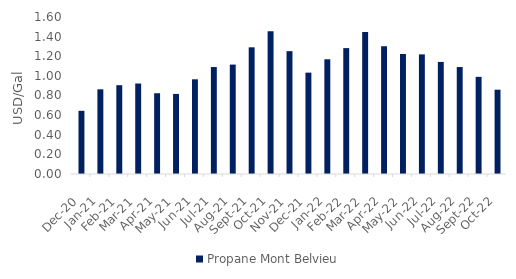
| Category | Propane Mont Belvieu |
|---|---|
| 2020-12-01 | 0.644 |
| 2021-01-01 | 0.863 |
| 2021-02-01 | 0.905 |
| 2021-03-01 | 0.922 |
| 2021-04-01 | 0.823 |
| 2021-05-01 | 0.816 |
| 2021-06-01 | 0.965 |
| 2021-07-01 | 1.09 |
| 2021-08-01 | 1.115 |
| 2021-09-01 | 1.291 |
| 2021-10-01 | 1.454 |
| 2021-11-01 | 1.252 |
| 2021-12-01 | 1.033 |
| 2022-01-01 | 1.169 |
| 2022-02-01 | 1.283 |
| 2022-03-01 | 1.448 |
| 2022-04-01 | 1.302 |
| 2022-05-01 | 1.223 |
| 2022-06-01 | 1.219 |
| 2022-07-01 | 1.142 |
| 2022-08-01 | 1.09 |
| 2022-09-01 | 0.99 |
| 2022-10-01 | 0.859 |